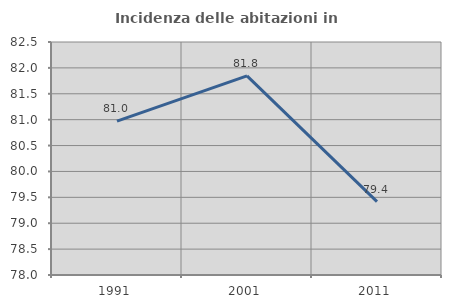
| Category | Incidenza delle abitazioni in proprietà  |
|---|---|
| 1991.0 | 80.971 |
| 2001.0 | 81.847 |
| 2011.0 | 79.416 |